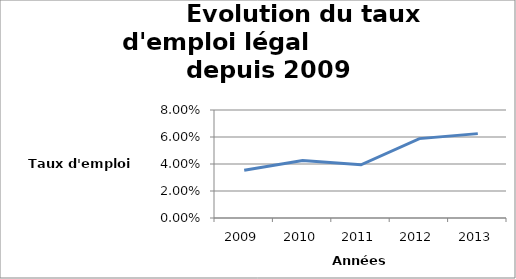
| Category | Series 0 |
|---|---|
| 2009.0 | 0.035 |
| 2010.0 | 0.043 |
| 2011.0 | 0.039 |
| 2012.0 | 0.059 |
| 2013.0 | 0.062 |